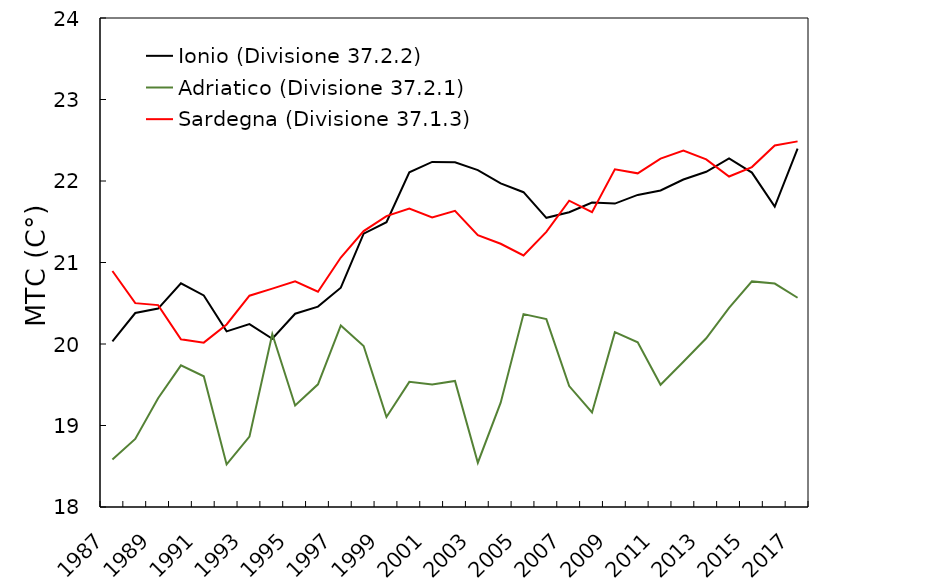
| Category | Ionio (Divisione 37.2.2) | Adriatico (Divisione 37.2.1) | Sardegna (Divisione 37.1.3) |
|---|---|---|---|
| 1987.0 | 20.033 | 18.583 | 20.896 |
| 1988.0 | 20.38 | 18.835 | 20.501 |
| 1989.0 | 20.434 | 19.335 | 20.477 |
| 1990.0 | 20.744 | 19.738 | 20.058 |
| 1991.0 | 20.596 | 19.603 | 20.017 |
| 1992.0 | 20.155 | 18.523 | 20.24 |
| 1993.0 | 20.243 | 18.864 | 20.593 |
| 1994.0 | 20.064 | 20.122 | 20.679 |
| 1995.0 | 20.372 | 19.245 | 20.769 |
| 1996.0 | 20.459 | 19.505 | 20.641 |
| 1997.0 | 20.691 | 20.228 | 21.061 |
| 1998.0 | 21.353 | 19.976 | 21.385 |
| 1999.0 | 21.494 | 19.105 | 21.57 |
| 2000.0 | 22.107 | 19.535 | 21.662 |
| 2001.0 | 22.234 | 19.504 | 21.552 |
| 2002.0 | 22.229 | 19.547 | 21.633 |
| 2003.0 | 22.133 | 18.543 | 21.336 |
| 2004.0 | 21.971 | 19.28 | 21.23 |
| 2005.0 | 21.862 | 20.367 | 21.087 |
| 2006.0 | 21.548 | 20.305 | 21.376 |
| 2007.0 | 21.616 | 19.483 | 21.758 |
| 2008.0 | 21.736 | 19.159 | 21.618 |
| 2009.0 | 21.723 | 20.145 | 22.143 |
| 2010.0 | 21.829 | 20.02 | 22.094 |
| 2011.0 | 21.884 | 19.5 | 22.274 |
| 2012.0 | 22.018 | 19.782 | 22.374 |
| 2013.0 | 22.114 | 20.071 | 22.266 |
| 2014.0 | 22.278 | 20.443 | 22.055 |
| 2015.0 | 22.103 | 20.768 | 22.171 |
| 2016.0 | 21.686 | 20.741 | 22.435 |
| 2017.0 | 22.398 | 20.567 | 22.486 |